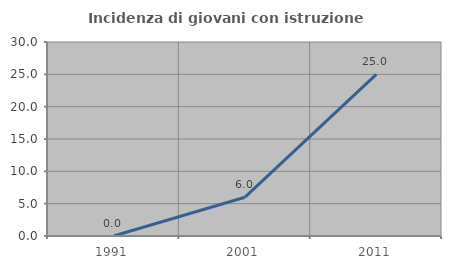
| Category | Incidenza di giovani con istruzione universitaria |
|---|---|
| 1991.0 | 0 |
| 2001.0 | 6 |
| 2011.0 | 25 |